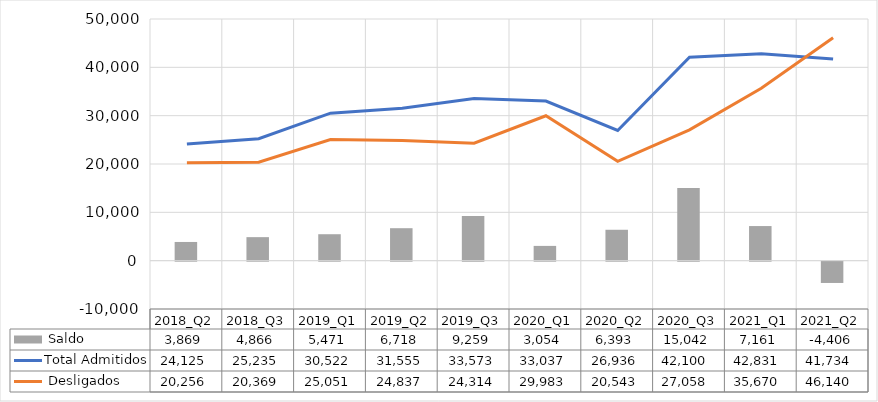
| Category | Total |
|---|---|
| 2018_Q2 | 3869 |
| 2018_Q3 | 4866 |
| 2019_Q1 | 5471 |
| 2019_Q2 | 6718 |
| 2019_Q3 | 9259 |
| 2020_Q1 | 3054 |
| 2020_Q2 | 6393 |
| 2020_Q3 | 15042 |
| 2021_Q1 | 7161 |
| 2021_Q2 | -4406 |